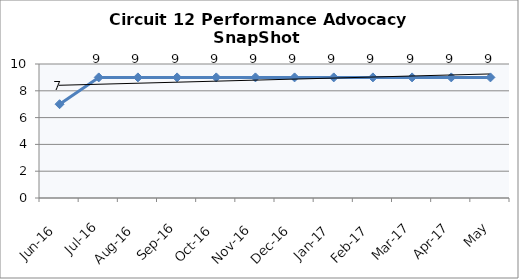
| Category | Circuit 12 |
|---|---|
| Jun-16 | 7 |
| Jul-16 | 9 |
| Aug-16 | 9 |
| Sep-16 | 9 |
| Oct-16 | 9 |
| Nov-16 | 9 |
| Dec-16 | 9 |
| Jan-17 | 9 |
| Feb-17 | 9 |
| Mar-17 | 9 |
| Apr-17 | 9 |
| May | 9 |